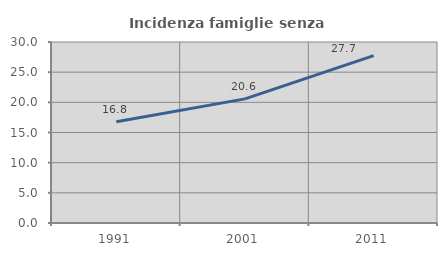
| Category | Incidenza famiglie senza nuclei |
|---|---|
| 1991.0 | 16.783 |
| 2001.0 | 20.574 |
| 2011.0 | 27.744 |